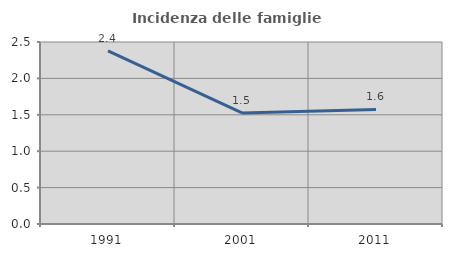
| Category | Incidenza delle famiglie numerose |
|---|---|
| 1991.0 | 2.379 |
| 2001.0 | 1.525 |
| 2011.0 | 1.573 |